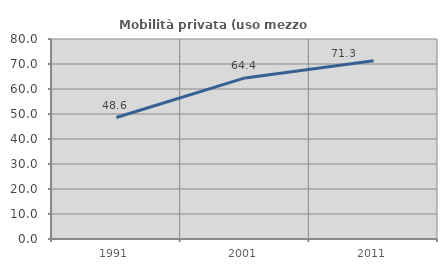
| Category | Mobilità privata (uso mezzo privato) |
|---|---|
| 1991.0 | 48.582 |
| 2001.0 | 64.432 |
| 2011.0 | 71.3 |